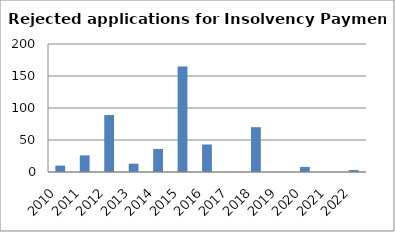
| Category | Series 0 |
|---|---|
| 2010.0 | 10 |
| 2011.0 | 26 |
| 2012.0 | 89 |
| 2013.0 | 13 |
| 2014.0 | 36 |
| 2015.0 | 165 |
| 2016.0 | 43 |
| 2017.0 | 0 |
| 2018.0 | 70 |
| 2019.0 | 0 |
| 2020.0 | 8 |
| 2021.0 | 0 |
| 2022.0 | 3 |